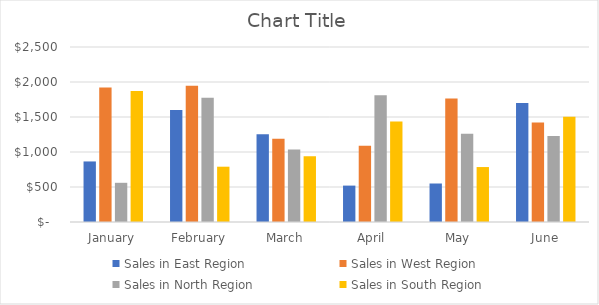
| Category | Sales in East Region | Sales in West Region | Sales in North Region | Sales in South Region |
|---|---|---|---|---|
| January | 865 | 1920 | 560 | 1870 |
| February | 1600 | 1945 | 1775 | 790 |
| March | 1255 | 1190 | 1035 | 940 |
| April | 520 | 1090 | 1810 | 1435 |
| May | 550 | 1765 | 1260 | 785 |
| June | 1700 | 1420 | 1230 | 1505 |